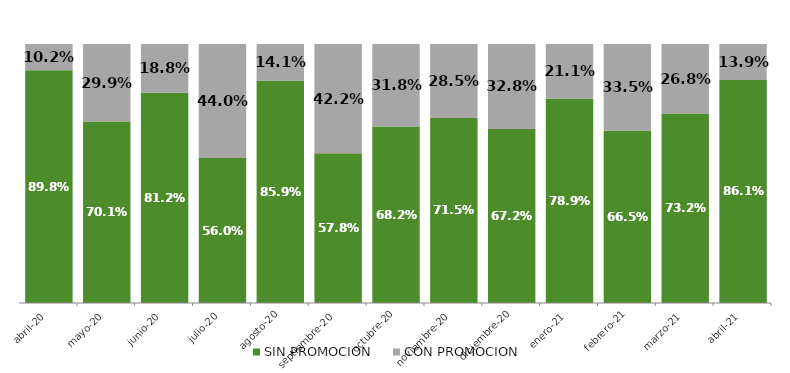
| Category | SIN PROMOCION   | CON PROMOCION   |
|---|---|---|
| 2020-04-01 | 0.898 | 0.102 |
| 2020-05-01 | 0.701 | 0.299 |
| 2020-06-01 | 0.812 | 0.188 |
| 2020-07-01 | 0.56 | 0.44 |
| 2020-08-01 | 0.859 | 0.141 |
| 2020-09-01 | 0.578 | 0.422 |
| 2020-10-01 | 0.682 | 0.318 |
| 2020-11-01 | 0.715 | 0.285 |
| 2020-12-01 | 0.672 | 0.328 |
| 2021-01-01 | 0.789 | 0.211 |
| 2021-02-01 | 0.665 | 0.335 |
| 2021-03-01 | 0.732 | 0.268 |
| 2021-04-01 | 0.861 | 0.139 |